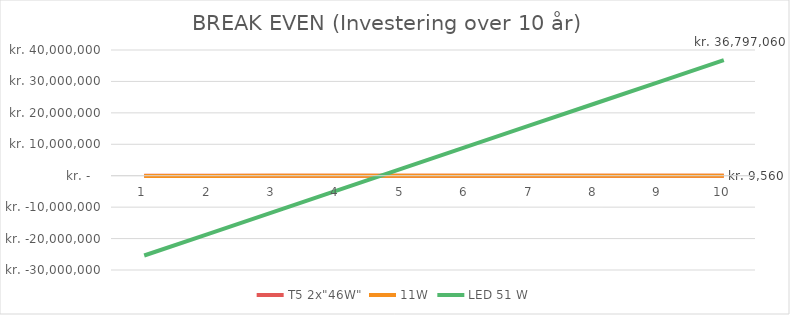
| Category | T5 2x"46W" | 11W | 19W Rax (on/off) | LED 51 W |
|---|---|---|---|---|
| 0 | 0 | -62044 |  | -25386099.082 |
| 1 | 0 | -54088 |  | -18476859.165 |
| 2 | 0 | -46132 |  | -11567619.247 |
| 3 | 0 | -38176 |  | -4658379.33 |
| 4 | 0 | -30220 |  | 2250860.588 |
| 5 | 0 | -22264 |  | 9160100.506 |
| 6 | 0 | -14308 |  | 16069340.423 |
| 7 | 0 | -6352 |  | 22978580.341 |
| 8 | 0 | 1604 |  | 29887820.259 |
| 9 | 0 | 9560 |  | 36797060.176 |